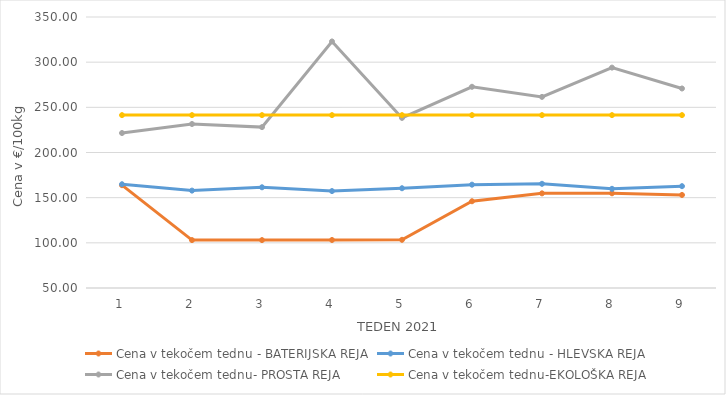
| Category | Cena v tekočem tednu - BATERIJSKA REJA | Cena v tekočem tednu - HLEVSKA REJA | Cena v tekočem tednu- PROSTA REJA | Cena v tekočem tednu-EKOLOŠKA REJA |
|---|---|---|---|---|
| 1.0 | 163.81 | 164.86 | 221.55 | 241.38 |
| 2.0 | 103.02 | 157.81 | 231.55 | 241.38 |
| 3.0 | 103.03 | 161.48 | 228.1 | 241.38 |
| 4.0 | 103.15 | 157.29 | 322.93 | 241.38 |
| 5.0 | 103.34 | 160.43 | 238.28 | 241.38 |
| 6.0 | 146.03 | 164.39 | 272.76 | 241.38 |
| 7.0 | 154.77 | 165.34 | 261.55 | 241.38 |
| 8.0 | 154.86 | 159.79 | 293.97 | 241.38 |
| 9.0 | 153 | 162.73 | 270.86 | 241.38 |